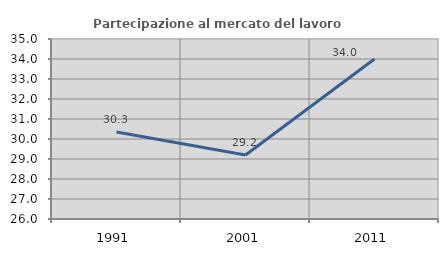
| Category | Partecipazione al mercato del lavoro  femminile |
|---|---|
| 1991.0 | 30.346 |
| 2001.0 | 29.2 |
| 2011.0 | 33.999 |